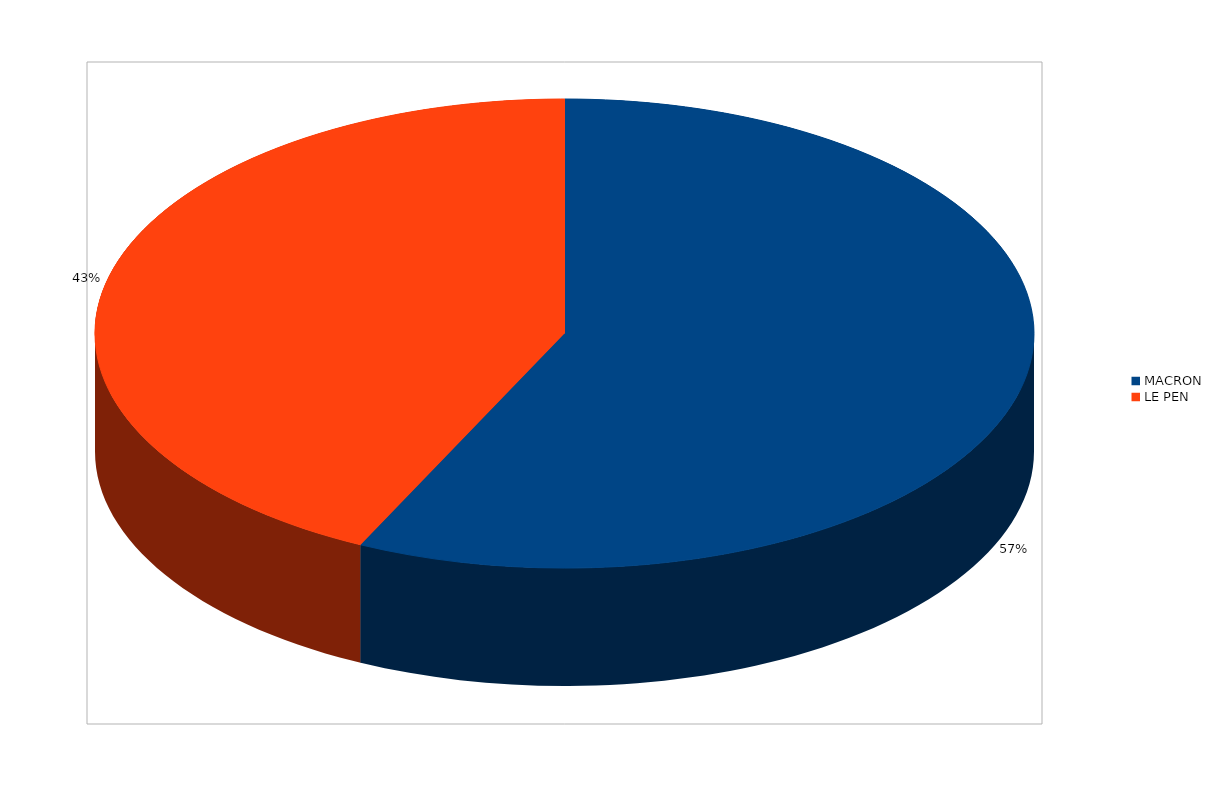
| Category | Series 0 |
|---|---|
| MACRON | 19274 |
| LE PEN | 14452 |